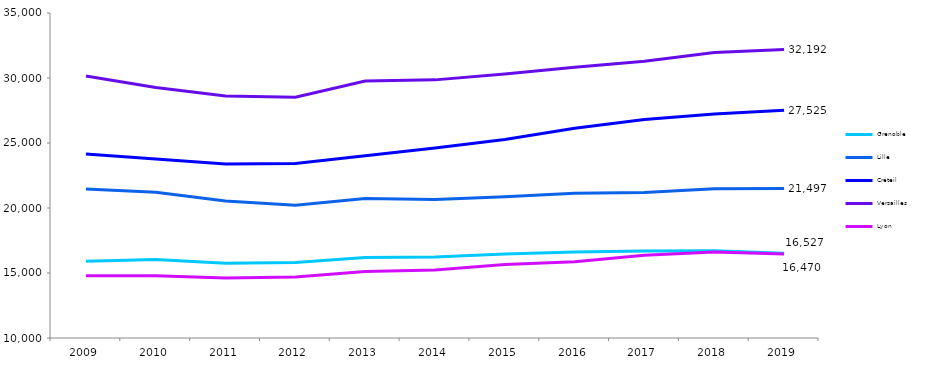
| Category | Grenoble | Lille | Créteil | Versailles | Lyon |
|---|---|---|---|---|---|
| 2009.0 | 15900 | 21455 | 24160 | 30150 | 14792 |
| 2010.0 | 16038 | 21218 | 23766 | 29264 | 14783 |
| 2011.0 | 15756 | 20534 | 23379 | 28618 | 14623 |
| 2012.0 | 15813 | 20217 | 23422 | 28524 | 14698 |
| 2013.0 | 16191 | 20735 | 24011 | 29774 | 15109 |
| 2014.0 | 16231 | 20661 | 24613 | 29856 | 15230 |
| 2015.0 | 16468 | 20859 | 25276 | 30305 | 15658 |
| 2016.0 | 16619 | 21142 | 26135 | 30818 | 15860 |
| 2017.0 | 16693 | 21199 | 26814 | 31285 | 16364 |
| 2018.0 | 16706 | 21488 | 27236 | 31961 | 16620 |
| 2019.0 | 16527 | 21497 | 27525 | 32192 | 16470 |